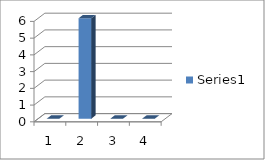
| Category | Series 0 |
|---|---|
| 0 | 0 |
| 1 | 6 |
| 2 | 0 |
| 3 | 0 |